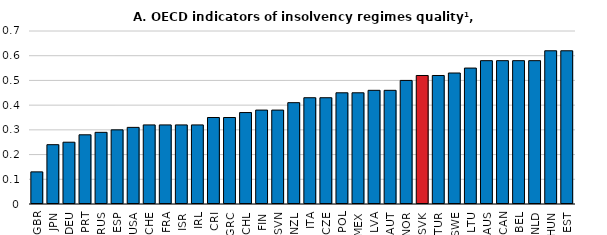
| Category | insol13 |
|---|---|
| GBR | 0.13 |
| JPN | 0.24 |
| DEU | 0.25 |
| PRT | 0.28 |
| RUS | 0.29 |
| ESP | 0.3 |
| USA | 0.31 |
| CHE | 0.32 |
| FRA | 0.32 |
| ISR | 0.32 |
| IRL | 0.32 |
| CRI | 0.35 |
| GRC | 0.35 |
| CHL | 0.37 |
| FIN | 0.38 |
| SVN | 0.38 |
| NZL | 0.41 |
| ITA | 0.43 |
| CZE | 0.43 |
| POL | 0.45 |
| MEX | 0.45 |
| LVA | 0.46 |
| AUT | 0.46 |
| NOR | 0.5 |
| SVK | 0.52 |
| TUR | 0.52 |
| SWE | 0.53 |
| LTU | 0.55 |
| AUS | 0.58 |
| CAN | 0.58 |
| BEL | 0.58 |
| NLD | 0.58 |
| HUN | 0.62 |
| EST | 0.62 |